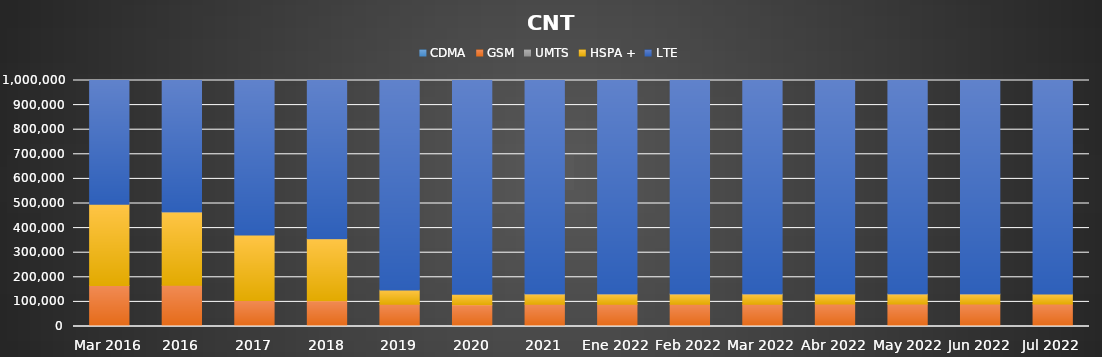
| Category | CDMA | GSM | UMTS | HSPA + | LTE |
|---|---|---|---|---|---|
| Mar 2016 | 0 | 166950 | 0 | 329835 | 678162 |
| 2016 | 0 | 167794 | 0 | 297924 | 1075501 |
| 2017 | 0 | 105840 | 0 | 265966 | 1770311 |
| 2018 | 0 | 104907 | 0 | 252233 | 2488002 |
| 2019 | 0 | 90785 | 0 | 57576 | 2755329 |
| 2020 | 0 | 88328 | 0 | 42633 | 2695427 |
| 2021 | 0 | 90490 | 0 | 41720 | 2737207 |
| Ene 2022 | 0 | 90494 | 0 | 41783 | 2747791 |
| Feb 2022 | 0 | 90620 | 0 | 41640 | 2753688 |
| Mar 2022 | 0 | 90669 | 0 | 41489 | 2761348 |
| Abr 2022 | 0 | 91159 | 0 | 41412 | 2772081 |
| May 2022 | 0 | 91080 | 0 | 41208 | 2783764 |
| Jun 2022 | 0 | 91099 | 0 | 41107 | 2794736 |
| Jul 2022 | 0 | 91112 | 0 | 41044 | 2808197 |